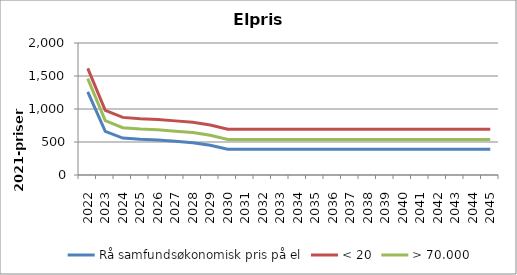
| Category | Rå samfundsøkonomisk pris på el | < 20 | > 70.000 |
|---|---|---|---|
| 2022.0 | 1260 | 1616 | 1460 |
| 2023.0 | 660 | 980 | 824 |
| 2024.0 | 560 | 873 | 717 |
| 2025.0 | 540 | 852 | 696 |
| 2026.0 | 530 | 842 | 686 |
| 2027.0 | 510 | 820 | 664 |
| 2028.0 | 490 | 799 | 643 |
| 2029.0 | 450 | 757 | 601 |
| 2030.0 | 390 | 693 | 537 |
| 2031.0 | 390 | 693 | 537 |
| 2032.0 | 390 | 693 | 537 |
| 2033.0 | 390 | 693 | 537 |
| 2034.0 | 390 | 693 | 537 |
| 2035.0 | 390 | 693 | 537 |
| 2036.0 | 390 | 693 | 537 |
| 2037.0 | 390 | 693 | 537 |
| 2038.0 | 390 | 693 | 537 |
| 2039.0 | 390 | 693 | 537 |
| 2040.0 | 390 | 693 | 537 |
| 2041.0 | 390 | 693 | 537 |
| 2042.0 | 390 | 693 | 537 |
| 2043.0 | 390 | 693 | 537 |
| 2044.0 | 390 | 693 | 537 |
| 2045.0 | 390 | 693 | 537 |